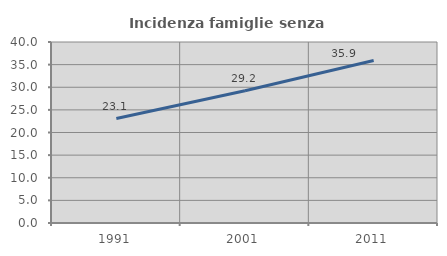
| Category | Incidenza famiglie senza nuclei |
|---|---|
| 1991.0 | 23.077 |
| 2001.0 | 29.233 |
| 2011.0 | 35.897 |